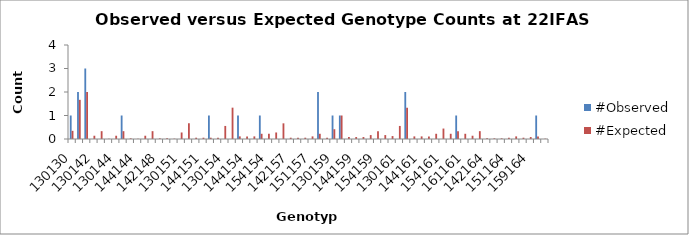
| Category | #Observed | #Expected |
|---|---|---|
| 130130.0 | 1 | 0.347 |
| 130137.0 | 2 | 1.667 |
| 137137.0 | 3 | 2 |
| 130142.0 | 0 | 0.139 |
| 137142.0 | 0 | 0.333 |
| 142142.0 | 0 | 0.014 |
| 130144.0 | 0 | 0.139 |
| 137144.0 | 1 | 0.333 |
| 142144.0 | 0 | 0.028 |
| 144144.0 | 0 | 0.014 |
| 130148.0 | 0 | 0.139 |
| 137148.0 | 0 | 0.333 |
| 142148.0 | 0 | 0.028 |
| 144148.0 | 0 | 0.028 |
| 148148.0 | 0 | 0.014 |
| 130151.0 | 0 | 0.278 |
| 137151.0 | 0 | 0.667 |
| 142151.0 | 0 | 0.056 |
| 144151.0 | 0 | 0.056 |
| 148151.0 | 1 | 0.056 |
| 151151.0 | 0 | 0.056 |
| 130154.0 | 0 | 0.556 |
| 137154.0 | 0 | 1.333 |
| 142154.0 | 1 | 0.111 |
| 144154.0 | 0 | 0.111 |
| 148154.0 | 0 | 0.111 |
| 151154.0 | 1 | 0.222 |
| 154154.0 | 0 | 0.222 |
| 130157.0 | 0 | 0.278 |
| 137157.0 | 0 | 0.667 |
| 142157.0 | 0 | 0.056 |
| 144157.0 | 0 | 0.056 |
| 148157.0 | 0 | 0.056 |
| 151157.0 | 0 | 0.111 |
| 154157.0 | 2 | 0.222 |
| 157157.0 | 0 | 0.056 |
| 130159.0 | 1 | 0.417 |
| 137159.0 | 1 | 1 |
| 142159.0 | 0 | 0.083 |
| 144159.0 | 0 | 0.083 |
| 148159.0 | 0 | 0.083 |
| 151159.0 | 0 | 0.167 |
| 154159.0 | 0 | 0.333 |
| 157159.0 | 0 | 0.167 |
| 159159.0 | 0 | 0.125 |
| 130161.0 | 0 | 0.556 |
| 137161.0 | 2 | 1.333 |
| 142161.0 | 0 | 0.111 |
| 144161.0 | 0 | 0.111 |
| 148161.0 | 0 | 0.111 |
| 151161.0 | 0 | 0.222 |
| 154161.0 | 0 | 0.444 |
| 157161.0 | 0 | 0.222 |
| 159161.0 | 1 | 0.333 |
| 161161.0 | 0 | 0.222 |
| 130164.0 | 0 | 0.139 |
| 137164.0 | 0 | 0.333 |
| 142164.0 | 0 | 0.028 |
| 144164.0 | 0 | 0.028 |
| 148164.0 | 0 | 0.028 |
| 151164.0 | 0 | 0.056 |
| 154164.0 | 0 | 0.111 |
| 157164.0 | 0 | 0.056 |
| 159164.0 | 0 | 0.083 |
| 161164.0 | 1 | 0.111 |
| 164164.0 | 0 | 0.014 |